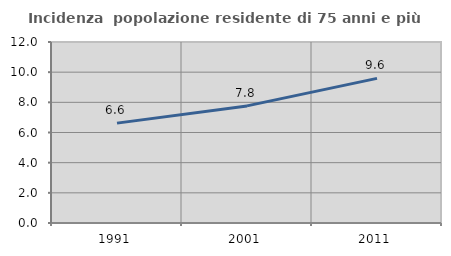
| Category | Incidenza  popolazione residente di 75 anni e più |
|---|---|
| 1991.0 | 6.621 |
| 2001.0 | 7.763 |
| 2011.0 | 9.59 |